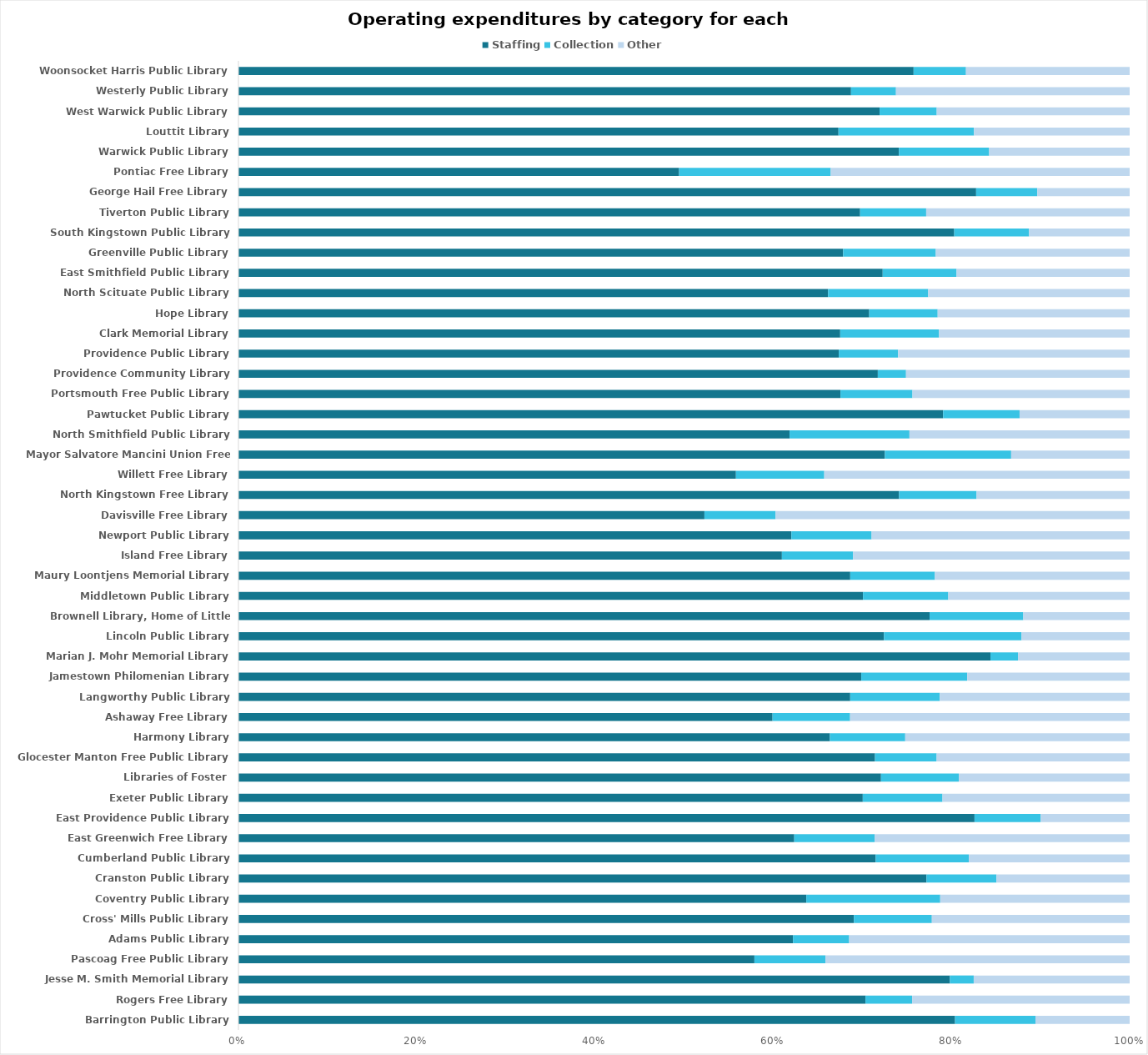
| Category |  Staffing  |  Collection  |  Other  |
|---|---|---|---|
| Barrington Public Library | 0.804 | 0.09 | 0.106 |
| Rogers Free Library | 0.704 | 0.052 | 0.244 |
| Jesse M. Smith Memorial Library | 0.798 | 0.027 | 0.175 |
| Pascoag Free Public Library | 0.579 | 0.08 | 0.341 |
| Adams Public Library | 0.622 | 0.063 | 0.315 |
| Cross' Mills Public Library | 0.691 | 0.087 | 0.222 |
| Coventry Public Library | 0.637 | 0.15 | 0.213 |
| Cranston Public Library | 0.772 | 0.079 | 0.149 |
| Cumberland Public Library | 0.715 | 0.104 | 0.18 |
| East Greenwich Free Library | 0.624 | 0.09 | 0.286 |
| East Providence Public Library | 0.826 | 0.074 | 0.1 |
| Exeter Public Library | 0.701 | 0.089 | 0.21 |
| Libraries of Foster | 0.721 | 0.087 | 0.192 |
| Glocester Manton Free Public Library | 0.714 | 0.069 | 0.217 |
| Harmony Library | 0.664 | 0.085 | 0.252 |
| Ashaway Free Library | 0.599 | 0.087 | 0.314 |
| Langworthy Public Library | 0.686 | 0.101 | 0.213 |
| Jamestown Philomenian Library | 0.699 | 0.119 | 0.182 |
| Marian J. Mohr Memorial Library | 0.844 | 0.031 | 0.125 |
| Lincoln Public Library | 0.724 | 0.154 | 0.121 |
| Brownell Library, Home of Little Compton | 0.776 | 0.105 | 0.119 |
| Middletown Public Library | 0.701 | 0.096 | 0.203 |
| Maury Loontjens Memorial Library | 0.686 | 0.095 | 0.219 |
| Island Free Library | 0.61 | 0.08 | 0.31 |
| Newport Public Library | 0.62 | 0.09 | 0.29 |
| Davisville Free Library | 0.523 | 0.08 | 0.397 |
| North Kingstown Free Library | 0.741 | 0.087 | 0.172 |
| Willett Free Library | 0.558 | 0.099 | 0.343 |
| Mayor Salvatore Mancini Union Free Library | 0.725 | 0.142 | 0.133 |
| North Smithfield Public Library | 0.618 | 0.135 | 0.247 |
| Pawtucket Public Library | 0.791 | 0.086 | 0.124 |
| Portsmouth Free Public Library | 0.676 | 0.081 | 0.244 |
| Providence Community Library | 0.717 | 0.032 | 0.251 |
| Providence Public Library | 0.674 | 0.067 | 0.26 |
| Clark Memorial Library | 0.675 | 0.111 | 0.214 |
| Hope Library | 0.708 | 0.077 | 0.215 |
| North Scituate Public Library | 0.662 | 0.112 | 0.226 |
| East Smithfield Public Library | 0.723 | 0.083 | 0.194 |
| Greenville Public Library | 0.679 | 0.104 | 0.218 |
| South Kingstown Public Library | 0.803 | 0.084 | 0.113 |
| Tiverton Public Library | 0.698 | 0.074 | 0.228 |
| George Hail Free Library | 0.828 | 0.069 | 0.104 |
| Pontiac Free Library | 0.494 | 0.17 | 0.335 |
| Warwick Public Library | 0.741 | 0.101 | 0.158 |
| Louttit Library | 0.673 | 0.152 | 0.175 |
| West Warwick Public Library | 0.719 | 0.064 | 0.216 |
| Westerly Public Library | 0.687 | 0.05 | 0.262 |
| Woonsocket Harris Public Library | 0.758 | 0.059 | 0.184 |